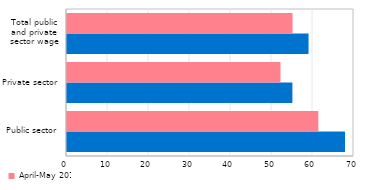
| Category | April-May 2020 | April-May 2019 |
|---|---|---|
| Public sector | 67.81 | 61.304 |
| Private sector | 54.974 | 52.067 |
| Total public
and private
sector wage | 58.912 | 55.012 |